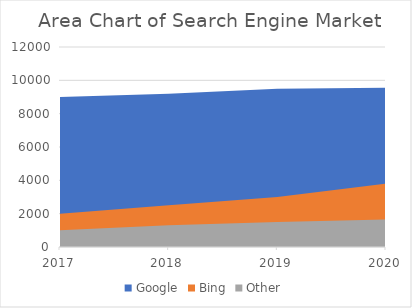
| Category | Google | Bing | Other |
|---|---|---|---|
| 2017.0 | 9000 | 2000 | 1000 |
| 2018.0 | 9200 | 2500 | 1300 |
| 2019.0 | 9500 | 3000 | 1500 |
| 2020.0 | 9550 | 3800 | 1650 |